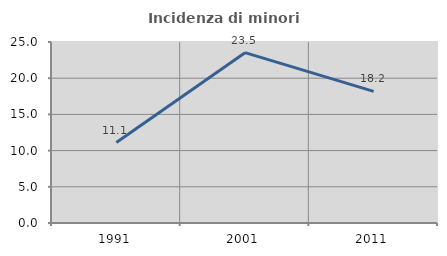
| Category | Incidenza di minori stranieri |
|---|---|
| 1991.0 | 11.111 |
| 2001.0 | 23.529 |
| 2011.0 | 18.182 |